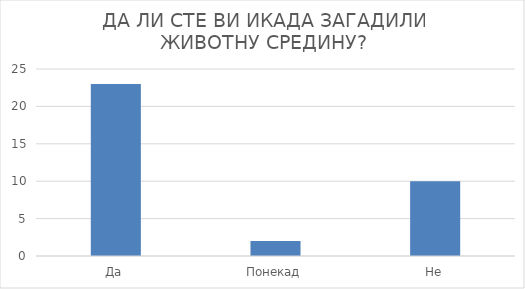
| Category | Series 0 |
|---|---|
| Да | 23 |
| Понекад | 2 |
| Не | 10 |